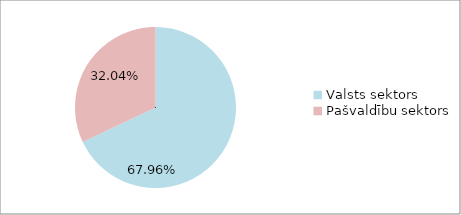
| Category | Series 0 |
|---|---|
| Valsts sektors | 0.68 |
| Pašvaldību sektors | 0.32 |